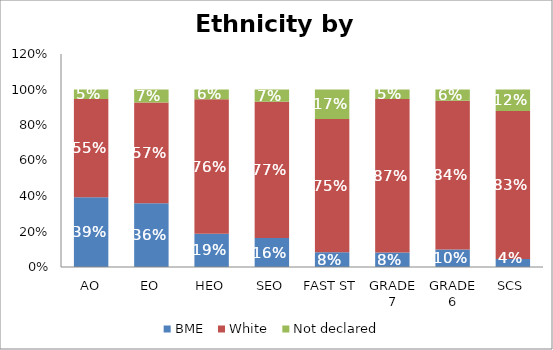
| Category | BME | White | Not declared |
|---|---|---|---|
| AO | 0.394 | 0.553 | 0.053 |
| EO | 0.36 | 0.567 | 0.073 |
| HEO | 0.187 | 0.758 | 0.055 |
| SEO | 0.163 | 0.769 | 0.069 |
| FAST ST | 0.083 | 0.75 | 0.167 |
| GRADE 7 | 0.081 | 0.866 | 0.053 |
| GRADE 6 | 0.098 | 0.838 | 0.064 |
| SCS | 0.045 | 0.834 | 0.121 |